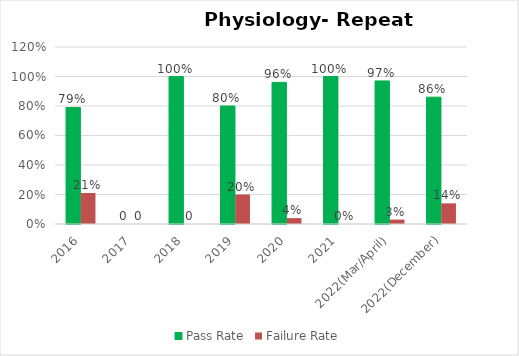
| Category | Pass Rate | Failure Rate |
|---|---|---|
| 2016 | 0.79 | 0.21 |
| 2017 | 0 | 0 |
| 2018 | 1 | 0 |
| 2019 | 0.8 | 0.2 |
| 2020 | 0.96 | 0.04 |
| 2021 | 1 | 0 |
| 2022(Mar/April) | 0.97 | 0.03 |
| 2022(December) | 0.86 | 0.14 |